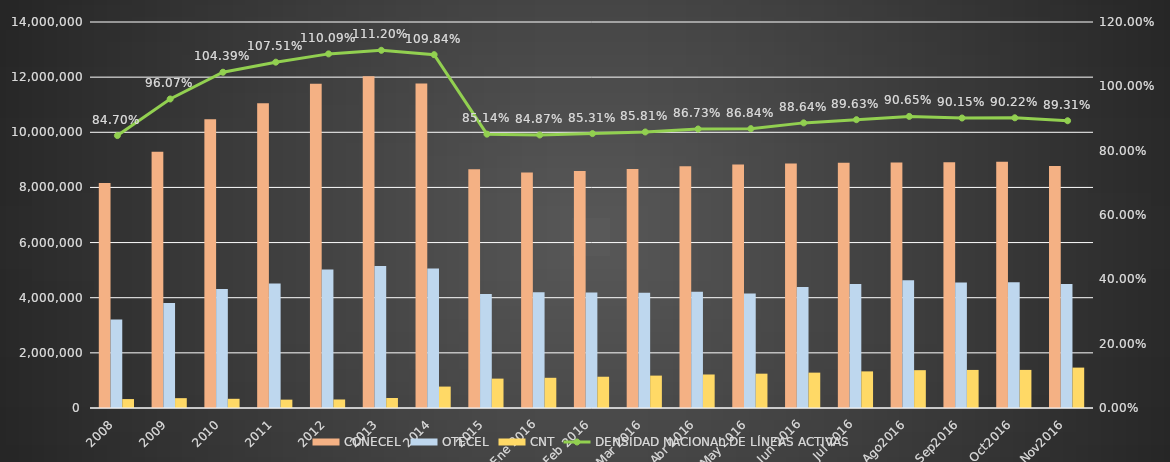
| Category | CONECEL | OTECEL | CNT |
|---|---|---|---|
| 2008 | 8156359 | 3211922 | 323967 |
| 2009 | 9291268 | 3806432 | 356900 |
| 2010 | 10470502 | 4314599 | 333730 |
| 2011 | 11057316 | 4513874 | 303368 |
| 2012 | 11757906 | 5019686 | 309271 |
| 2013 | 12030886 | 5148308 | 362560 |
| 2014 | 11772020 | 5055645 | 776892 |
| 2015 | 8658619 | 4134698 | 1065703 |
| Ene 2016 | 8537945 | 4200524 | 1095492 |
| Feb 2016 | 8600300 | 4188097 | 1134222 |
| Mar 2016 | 8664956 | 4182766 | 1174947 |
| Abr 2016 | 8763907 | 4211949 | 1215638 |
| May 2016 | 8830093 | 4151791 | 1245153 |
| Jun 2016 | 8864433 | 4392705 | 1282926 |
| Jul 2016 | 8893473 | 4499825 | 1328207 |
| Ago2016 | 8902397 | 4633731 | 1372087 |
| Sep2016 | 8915431 | 4548495 | 1380723 |
| Oct2016 | 8929127 | 4563659 | 1381589 |
| Nov2016 | 8777976 | 4499011 | 1465436 |